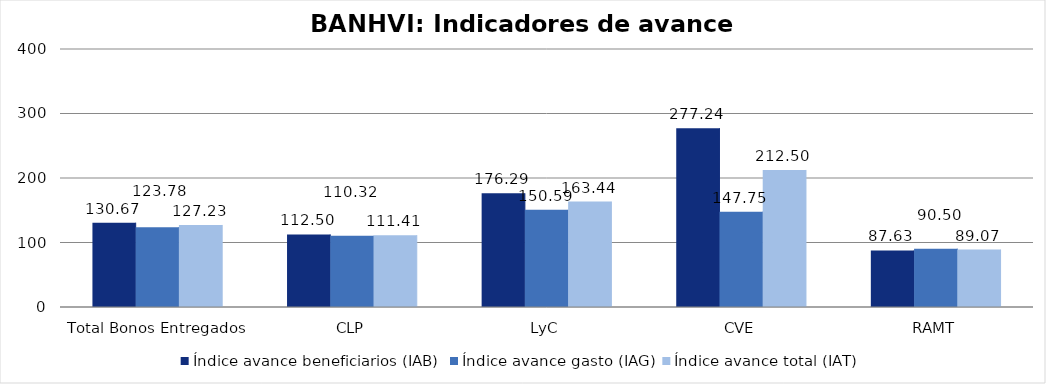
| Category | Índice avance beneficiarios (IAB)  | Índice avance gasto (IAG) | Índice avance total (IAT)  |
|---|---|---|---|
| Total Bonos Entregados | 130.67 | 123.782 | 127.226 |
| CLP | 112.502 | 110.317 | 111.41 |
| LyC | 176.294 | 150.591 | 163.443 |
| CVE | 277.243 | 147.753 | 212.498 |
| RAMT | 87.634 | 90.498 | 89.066 |